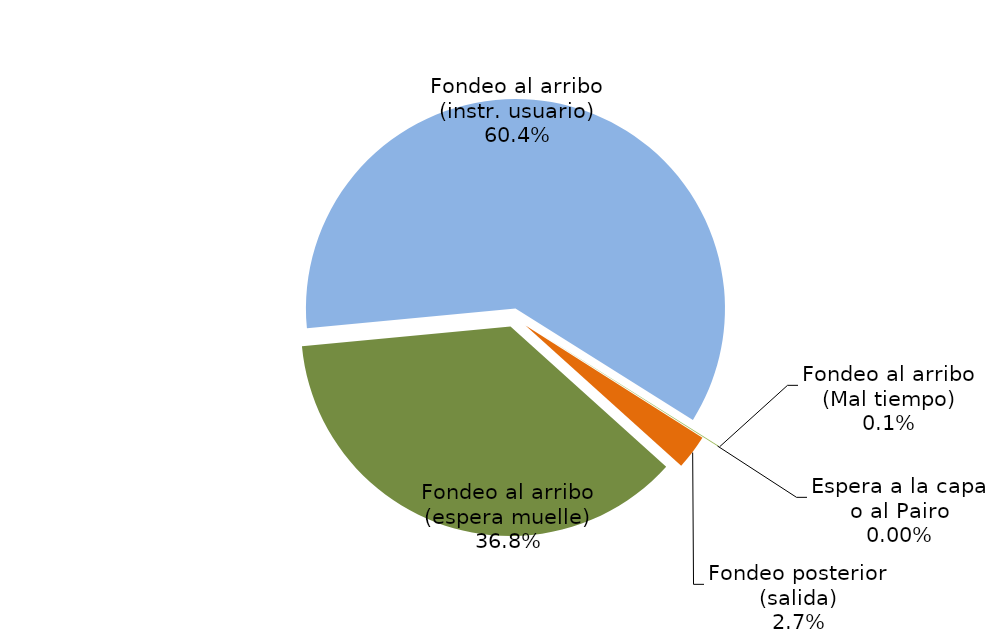
| Category | Series 0 |
|---|---|
| Fondeo al arribo (espera muelle) | 8401.655 |
| Fondeo al arribo (instr. usuario) | 13784.751 |
| Fondeo al arribo (Mal tiempo) | 15 |
| Espera a la capa o al Pairo | 0 |
| Fondeo posterior (salida) | 609.977 |